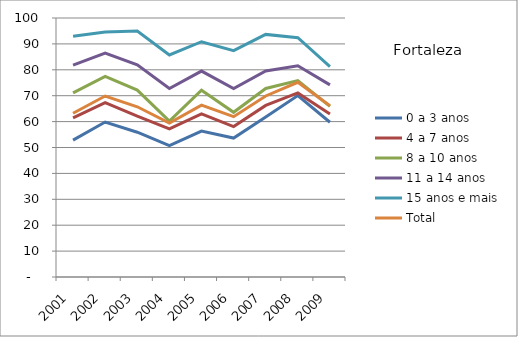
| Category | 0 a 3 anos | 4 a 7 anos | 8 a 10 anos | 11 a 14 anos | 15 anos e mais | Total |
|---|---|---|---|---|---|---|
| 2001.0 | 52.86 | 61.47 | 71.09 | 81.81 | 92.93 | 63.23 |
| 2002.0 | 59.84 | 67.35 | 77.47 | 86.42 | 94.56 | 69.87 |
| 2003.0 | 55.9 | 62.1 | 72.16 | 81.95 | 94.98 | 65.72 |
| 2004.0 | 50.73 | 57.19 | 60.16 | 72.79 | 85.72 | 59.4 |
| 2005.0 | 56.35 | 63.01 | 72.11 | 79.51 | 90.84 | 66.33 |
| 2006.0 | 53.64 | 58.06 | 63.59 | 72.79 | 87.39 | 61.9 |
| 2007.0 | 61.81 | 66.24 | 72.78 | 79.54 | 93.67 | 69.9 |
| 2008.0 | 70.05 | 71.09 | 75.85 | 81.55 | 92.39 | 75.19 |
| 2009.0 | 59.75 | 62.95 | 65.9 | 74.19 | 81.2 | 66.11 |